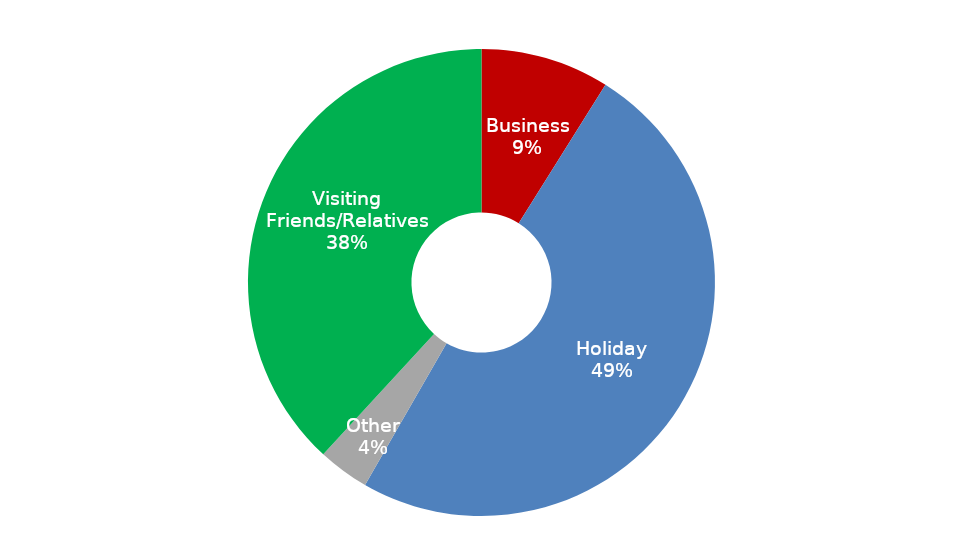
| Category | October 2016 - September 2017 |
|---|---|
| Business | 443755.348 |
| Holiday | 2460952.393 |
| Other | 176447.394 |
| Visiting Friends/Relatives | 1900306.163 |